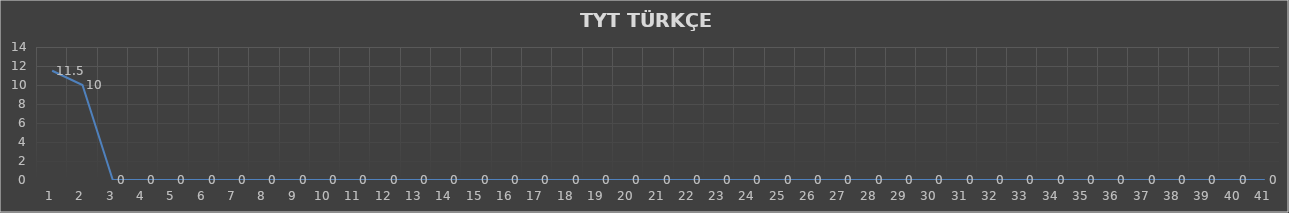
| Category | Series 0 |
|---|---|
| 0 | 11.5 |
| 1 | 10 |
| 2 | 0 |
| 3 | 0 |
| 4 | 0 |
| 5 | 0 |
| 6 | 0 |
| 7 | 0 |
| 8 | 0 |
| 9 | 0 |
| 10 | 0 |
| 11 | 0 |
| 12 | 0 |
| 13 | 0 |
| 14 | 0 |
| 15 | 0 |
| 16 | 0 |
| 17 | 0 |
| 18 | 0 |
| 19 | 0 |
| 20 | 0 |
| 21 | 0 |
| 22 | 0 |
| 23 | 0 |
| 24 | 0 |
| 25 | 0 |
| 26 | 0 |
| 27 | 0 |
| 28 | 0 |
| 29 | 0 |
| 30 | 0 |
| 31 | 0 |
| 32 | 0 |
| 33 | 0 |
| 34 | 0 |
| 35 | 0 |
| 36 | 0 |
| 37 | 0 |
| 38 | 0 |
| 39 | 0 |
| 40 | 0 |